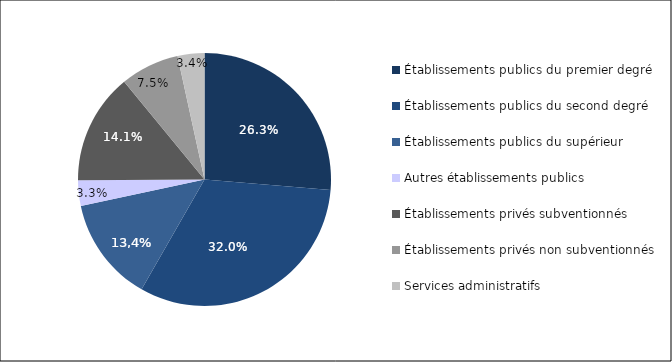
| Category | Series 0 |
|---|---|
| Établissements publics du premier degré | 36359 |
| Établissements publics du second degré | 44182 |
| Établissements publics du supérieur | 18444 |
| Autres établissements publics | 4543 |
| Établissements privés subventionnés | 19530 |
| Établissements privés non subventionnés | 10403 |
| Services administratifs | 4729 |